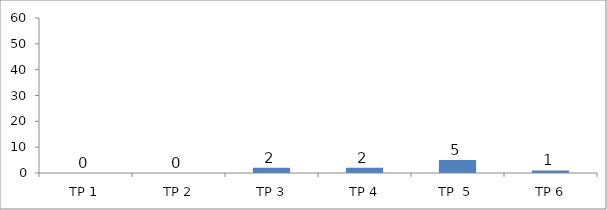
| Category | BIL. MURID |
|---|---|
| TP 1 | 0 |
| TP 2 | 0 |
|  TP 3 | 2 |
| TP 4 | 2 |
| TP  5 | 5 |
| TP 6 | 1 |